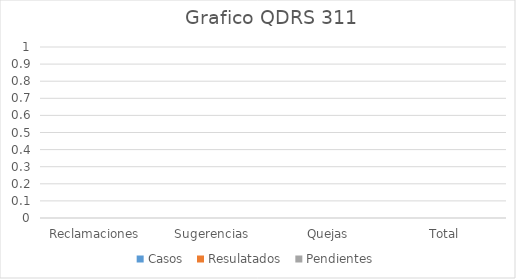
| Category | Casos  | Resulatados  | Pendientes |
|---|---|---|---|
| Reclamaciones  | 0 | 0 | 0 |
| Sugerencias  | 0 | 0 | 0 |
| Quejas  | 0 | 0 | 0 |
| Total  | 0 | 0 | 0 |